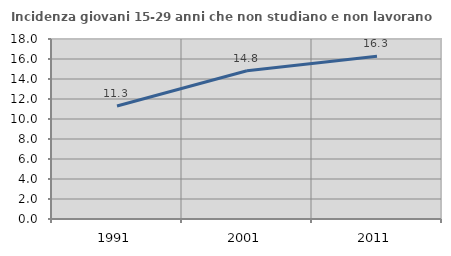
| Category | Incidenza giovani 15-29 anni che non studiano e non lavorano  |
|---|---|
| 1991.0 | 11.298 |
| 2001.0 | 14.828 |
| 2011.0 | 16.279 |